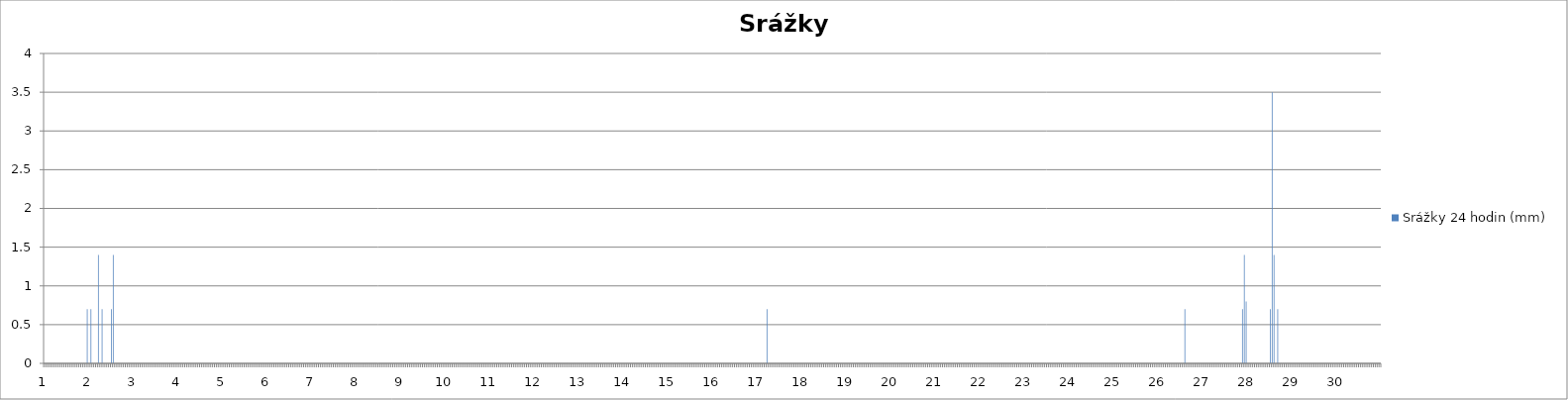
| Category | Srážky 24 hodin (mm) |
|---|---|
| 0 | 0 |
| 1 | 0 |
| 2 | 0 |
| 3 | 0 |
| 4 | 0 |
| 5 | 0 |
| 6 | 0 |
| 7 | 0 |
| 8 | 0 |
| 9 | 0 |
| 10 | 0 |
| 11 | 0 |
| 12 | 0 |
| 13 | 0 |
| 14 | 0 |
| 15 | 0 |
| 16 | 0 |
| 17 | 0 |
| 18 | 0 |
| 19 | 0 |
| 20 | 0 |
| 21 | 0 |
| 22 | 0 |
| 23 | 0.7 |
| 24 | 0 |
| 25 | 0.7 |
| 26 | 0 |
| 27 | 0 |
| 28 | 0 |
| 29 | 1.4 |
| 30 | 0 |
| 31 | 0.7 |
| 32 | 0 |
| 33 | 0 |
| 34 | 0 |
| 35 | 0 |
| 36 | 0.7 |
| 37 | 1.4 |
| 38 | 0 |
| 39 | 0 |
| 40 | 0 |
| 41 | 0 |
| 42 | 0 |
| 43 | 0 |
| 44 | 0 |
| 45 | 0 |
| 46 | 0 |
| 47 | 0 |
| 48 | 0 |
| 49 | 0 |
| 50 | 0 |
| 51 | 0 |
| 52 | 0 |
| 53 | 0 |
| 54 | 0 |
| 55 | 0 |
| 56 | 0 |
| 57 | 0 |
| 58 | 0 |
| 59 | 0 |
| 60 | 0 |
| 61 | 0 |
| 62 | 0 |
| 63 | 0 |
| 64 | 0 |
| 65 | 0 |
| 66 | 0 |
| 67 | 0 |
| 68 | 0 |
| 69 | 0 |
| 70 | 0 |
| 71 | 0 |
| 72 | 0 |
| 73 | 0 |
| 74 | 0 |
| 75 | 0 |
| 76 | 0 |
| 77 | 0 |
| 78 | 0 |
| 79 | 0 |
| 80 | 0 |
| 81 | 0 |
| 82 | 0 |
| 83 | 0 |
| 84 | 0 |
| 85 | 0 |
| 86 | 0 |
| 87 | 0 |
| 88 | 0 |
| 89 | 0 |
| 90 | 0 |
| 91 | 0 |
| 92 | 0 |
| 93 | 0 |
| 94 | 0 |
| 95 | 0 |
| 96 | 0 |
| 97 | 0 |
| 98 | 0 |
| 99 | 0 |
| 100 | 0 |
| 101 | 0 |
| 102 | 0 |
| 103 | 0 |
| 104 | 0 |
| 105 | 0 |
| 106 | 0 |
| 107 | 0 |
| 108 | 0 |
| 109 | 0 |
| 110 | 0 |
| 111 | 0 |
| 112 | 0 |
| 113 | 0 |
| 114 | 0 |
| 115 | 0 |
| 116 | 0 |
| 117 | 0 |
| 118 | 0 |
| 119 | 0 |
| 120 | 0 |
| 121 | 0 |
| 122 | 0 |
| 123 | 0 |
| 124 | 0 |
| 125 | 0 |
| 126 | 0 |
| 127 | 0 |
| 128 | 0 |
| 129 | 0 |
| 130 | 0 |
| 131 | 0 |
| 132 | 0 |
| 133 | 0 |
| 134 | 0 |
| 135 | 0 |
| 136 | 0 |
| 137 | 0 |
| 138 | 0 |
| 139 | 0 |
| 140 | 0 |
| 141 | 0 |
| 142 | 0 |
| 143 | 0 |
| 144 | 0 |
| 145 | 0 |
| 146 | 0 |
| 147 | 0 |
| 148 | 0 |
| 149 | 0 |
| 150 | 0 |
| 151 | 0 |
| 152 | 0 |
| 153 | 0 |
| 154 | 0 |
| 155 | 0 |
| 156 | 0 |
| 157 | 0 |
| 158 | 0 |
| 159 | 0 |
| 160 | 0 |
| 161 | 0 |
| 162 | 0 |
| 163 | 0 |
| 164 | 0 |
| 165 | 0 |
| 166 | 0 |
| 167 | 0 |
| 168 | 0 |
| 169 | 0 |
| 170 | 0 |
| 171 | 0 |
| 172 | 0 |
| 173 | 0 |
| 174 | 0 |
| 175 | 0 |
| 176 | 0 |
| 177 | 0 |
| 178 | 0 |
| 179 | 0 |
| 180 | 0 |
| 181 | 0 |
| 182 | 0 |
| 183 | 0 |
| 184 | 0 |
| 185 | 0 |
| 186 | 0 |
| 187 | 0 |
| 188 | 0 |
| 189 | 0 |
| 190 | 0 |
| 191 | 0 |
| 192 | 0 |
| 193 | 0 |
| 194 | 0 |
| 195 | 0 |
| 196 | 0 |
| 197 | 0 |
| 198 | 0 |
| 199 | 0 |
| 200 | 0 |
| 201 | 0 |
| 202 | 0 |
| 203 | 0 |
| 204 | 0 |
| 205 | 0 |
| 206 | 0 |
| 207 | 0 |
| 208 | 0 |
| 209 | 0 |
| 210 | 0 |
| 211 | 0 |
| 212 | 0 |
| 213 | 0 |
| 214 | 0 |
| 215 | 0 |
| 216 | 0 |
| 217 | 0 |
| 218 | 0 |
| 219 | 0 |
| 220 | 0 |
| 221 | 0 |
| 222 | 0 |
| 223 | 0 |
| 224 | 0 |
| 225 | 0 |
| 226 | 0 |
| 227 | 0 |
| 228 | 0 |
| 229 | 0 |
| 230 | 0 |
| 231 | 0 |
| 232 | 0 |
| 233 | 0 |
| 234 | 0 |
| 235 | 0 |
| 236 | 0 |
| 237 | 0 |
| 238 | 0 |
| 239 | 0 |
| 240 | 0 |
| 241 | 0 |
| 242 | 0 |
| 243 | 0 |
| 244 | 0 |
| 245 | 0 |
| 246 | 0 |
| 247 | 0 |
| 248 | 0 |
| 249 | 0 |
| 250 | 0 |
| 251 | 0 |
| 252 | 0 |
| 253 | 0 |
| 254 | 0 |
| 255 | 0 |
| 256 | 0 |
| 257 | 0 |
| 258 | 0 |
| 259 | 0 |
| 260 | 0 |
| 261 | 0 |
| 262 | 0 |
| 263 | 0 |
| 264 | 0 |
| 265 | 0 |
| 266 | 0 |
| 267 | 0 |
| 268 | 0 |
| 269 | 0 |
| 270 | 0 |
| 271 | 0 |
| 272 | 0 |
| 273 | 0 |
| 274 | 0 |
| 275 | 0 |
| 276 | 0 |
| 277 | 0 |
| 278 | 0 |
| 279 | 0 |
| 280 | 0 |
| 281 | 0 |
| 282 | 0 |
| 283 | 0 |
| 284 | 0 |
| 285 | 0 |
| 286 | 0 |
| 287 | 0 |
| 288 | 0 |
| 289 | 0 |
| 290 | 0 |
| 291 | 0 |
| 292 | 0 |
| 293 | 0 |
| 294 | 0 |
| 295 | 0 |
| 296 | 0 |
| 297 | 0 |
| 298 | 0 |
| 299 | 0 |
| 300 | 0 |
| 301 | 0 |
| 302 | 0 |
| 303 | 0 |
| 304 | 0 |
| 305 | 0 |
| 306 | 0 |
| 307 | 0 |
| 308 | 0 |
| 309 | 0 |
| 310 | 0 |
| 311 | 0 |
| 312 | 0 |
| 313 | 0 |
| 314 | 0 |
| 315 | 0 |
| 316 | 0 |
| 317 | 0 |
| 318 | 0 |
| 319 | 0 |
| 320 | 0 |
| 321 | 0 |
| 322 | 0 |
| 323 | 0 |
| 324 | 0 |
| 325 | 0 |
| 326 | 0 |
| 327 | 0 |
| 328 | 0 |
| 329 | 0 |
| 330 | 0 |
| 331 | 0 |
| 332 | 0 |
| 333 | 0 |
| 334 | 0 |
| 335 | 0 |
| 336 | 0 |
| 337 | 0 |
| 338 | 0 |
| 339 | 0 |
| 340 | 0 |
| 341 | 0 |
| 342 | 0 |
| 343 | 0 |
| 344 | 0 |
| 345 | 0 |
| 346 | 0 |
| 347 | 0 |
| 348 | 0 |
| 349 | 0 |
| 350 | 0 |
| 351 | 0 |
| 352 | 0 |
| 353 | 0 |
| 354 | 0 |
| 355 | 0 |
| 356 | 0 |
| 357 | 0 |
| 358 | 0 |
| 359 | 0 |
| 360 | 0 |
| 361 | 0 |
| 362 | 0 |
| 363 | 0 |
| 364 | 0 |
| 365 | 0 |
| 366 | 0 |
| 367 | 0 |
| 368 | 0 |
| 369 | 0 |
| 370 | 0 |
| 371 | 0 |
| 372 | 0 |
| 373 | 0 |
| 374 | 0 |
| 375 | 0 |
| 376 | 0 |
| 377 | 0 |
| 378 | 0 |
| 379 | 0 |
| 380 | 0 |
| 381 | 0 |
| 382 | 0 |
| 383 | 0 |
| 384 | 0 |
| 385 | 0 |
| 386 | 0 |
| 387 | 0 |
| 388 | 0 |
| 389 | 0.7 |
| 390 | 0 |
| 391 | 0 |
| 392 | 0 |
| 393 | 0 |
| 394 | 0 |
| 395 | 0 |
| 396 | 0 |
| 397 | 0 |
| 398 | 0 |
| 399 | 0 |
| 400 | 0 |
| 401 | 0 |
| 402 | 0 |
| 403 | 0 |
| 404 | 0 |
| 405 | 0 |
| 406 | 0 |
| 407 | 0 |
| 408 | 0 |
| 409 | 0 |
| 410 | 0 |
| 411 | 0 |
| 412 | 0 |
| 413 | 0 |
| 414 | 0 |
| 415 | 0 |
| 416 | 0 |
| 417 | 0 |
| 418 | 0 |
| 419 | 0 |
| 420 | 0 |
| 421 | 0 |
| 422 | 0 |
| 423 | 0 |
| 424 | 0 |
| 425 | 0 |
| 426 | 0 |
| 427 | 0 |
| 428 | 0 |
| 429 | 0 |
| 430 | 0 |
| 431 | 0 |
| 432 | 0 |
| 433 | 0 |
| 434 | 0 |
| 435 | 0 |
| 436 | 0 |
| 437 | 0 |
| 438 | 0 |
| 439 | 0 |
| 440 | 0 |
| 441 | 0 |
| 442 | 0 |
| 443 | 0 |
| 444 | 0 |
| 445 | 0 |
| 446 | 0 |
| 447 | 0 |
| 448 | 0 |
| 449 | 0 |
| 450 | 0 |
| 451 | 0 |
| 452 | 0 |
| 453 | 0 |
| 454 | 0 |
| 455 | 0 |
| 456 | 0 |
| 457 | 0 |
| 458 | 0 |
| 459 | 0 |
| 460 | 0 |
| 461 | 0 |
| 462 | 0 |
| 463 | 0 |
| 464 | 0 |
| 465 | 0 |
| 466 | 0 |
| 467 | 0 |
| 468 | 0 |
| 469 | 0 |
| 470 | 0 |
| 471 | 0 |
| 472 | 0 |
| 473 | 0 |
| 474 | 0 |
| 475 | 0 |
| 476 | 0 |
| 477 | 0 |
| 478 | 0 |
| 479 | 0 |
| 480 | 0 |
| 481 | 0 |
| 482 | 0 |
| 483 | 0 |
| 484 | 0 |
| 485 | 0 |
| 486 | 0 |
| 487 | 0 |
| 488 | 0 |
| 489 | 0 |
| 490 | 0 |
| 491 | 0 |
| 492 | 0 |
| 493 | 0 |
| 494 | 0 |
| 495 | 0 |
| 496 | 0 |
| 497 | 0 |
| 498 | 0 |
| 499 | 0 |
| 500 | 0 |
| 501 | 0 |
| 502 | 0 |
| 503 | 0 |
| 504 | 0 |
| 505 | 0 |
| 506 | 0 |
| 507 | 0 |
| 508 | 0 |
| 509 | 0 |
| 510 | 0 |
| 511 | 0 |
| 512 | 0 |
| 513 | 0 |
| 514 | 0 |
| 515 | 0 |
| 516 | 0 |
| 517 | 0 |
| 518 | 0 |
| 519 | 0 |
| 520 | 0 |
| 521 | 0 |
| 522 | 0 |
| 523 | 0 |
| 524 | 0 |
| 525 | 0 |
| 526 | 0 |
| 527 | 0 |
| 528 | 0 |
| 529 | 0 |
| 530 | 0 |
| 531 | 0 |
| 532 | 0 |
| 533 | 0 |
| 534 | 0 |
| 535 | 0 |
| 536 | 0 |
| 537 | 0 |
| 538 | 0 |
| 539 | 0 |
| 540 | 0 |
| 541 | 0 |
| 542 | 0 |
| 543 | 0 |
| 544 | 0 |
| 545 | 0 |
| 546 | 0 |
| 547 | 0 |
| 548 | 0 |
| 549 | 0 |
| 550 | 0 |
| 551 | 0 |
| 552 | 0 |
| 553 | 0 |
| 554 | 0 |
| 555 | 0 |
| 556 | 0 |
| 557 | 0 |
| 558 | 0 |
| 559 | 0 |
| 560 | 0 |
| 561 | 0 |
| 562 | 0 |
| 563 | 0 |
| 564 | 0 |
| 565 | 0 |
| 566 | 0 |
| 567 | 0 |
| 568 | 0 |
| 569 | 0 |
| 570 | 0 |
| 571 | 0 |
| 572 | 0 |
| 573 | 0 |
| 574 | 0 |
| 575 | 0 |
| 576 | 0 |
| 577 | 0 |
| 578 | 0 |
| 579 | 0 |
| 580 | 0 |
| 581 | 0 |
| 582 | 0 |
| 583 | 0 |
| 584 | 0 |
| 585 | 0 |
| 586 | 0 |
| 587 | 0 |
| 588 | 0 |
| 589 | 0 |
| 590 | 0 |
| 591 | 0 |
| 592 | 0 |
| 593 | 0 |
| 594 | 0 |
| 595 | 0 |
| 596 | 0 |
| 597 | 0 |
| 598 | 0 |
| 599 | 0 |
| 600 | 0 |
| 601 | 0 |
| 602 | 0 |
| 603 | 0 |
| 604 | 0 |
| 605 | 0 |
| 606 | 0 |
| 607 | 0 |
| 608 | 0 |
| 609 | 0 |
| 610 | 0 |
| 611 | 0 |
| 612 | 0 |
| 613 | 0 |
| 614 | 0.7 |
| 615 | 0 |
| 616 | 0 |
| 617 | 0 |
| 618 | 0 |
| 619 | 0 |
| 620 | 0 |
| 621 | 0 |
| 622 | 0 |
| 623 | 0 |
| 624 | 0 |
| 625 | 0 |
| 626 | 0 |
| 627 | 0 |
| 628 | 0 |
| 629 | 0 |
| 630 | 0 |
| 631 | 0 |
| 632 | 0 |
| 633 | 0 |
| 634 | 0 |
| 635 | 0 |
| 636 | 0 |
| 637 | 0 |
| 638 | 0 |
| 639 | 0 |
| 640 | 0 |
| 641 | 0 |
| 642 | 0 |
| 643 | 0 |
| 644 | 0 |
| 645 | 0.7 |
| 646 | 1.4 |
| 647 | 0.8 |
| 648 | 0 |
| 649 | 0 |
| 650 | 0 |
| 651 | 0 |
| 652 | 0 |
| 653 | 0 |
| 654 | 0 |
| 655 | 0 |
| 656 | 0 |
| 657 | 0 |
| 658 | 0 |
| 659 | 0 |
| 660 | 0.7 |
| 661 | 3.5 |
| 662 | 1.4 |
| 663 | 0 |
| 664 | 0.7 |
| 665 | 0 |
| 666 | 0 |
| 667 | 0 |
| 668 | 0 |
| 669 | 0 |
| 670 | 0 |
| 671 | 0 |
| 672 | 0 |
| 673 | 0 |
| 674 | 0 |
| 675 | 0 |
| 676 | 0 |
| 677 | 0 |
| 678 | 0 |
| 679 | 0 |
| 680 | 0 |
| 681 | 0 |
| 682 | 0 |
| 683 | 0 |
| 684 | 0 |
| 685 | 0 |
| 686 | 0 |
| 687 | 0 |
| 688 | 0 |
| 689 | 0 |
| 690 | 0 |
| 691 | 0 |
| 692 | 0 |
| 693 | 0 |
| 694 | 0 |
| 695 | 0 |
| 696 | 0 |
| 697 | 0 |
| 698 | 0 |
| 699 | 0 |
| 700 | 0 |
| 701 | 0 |
| 702 | 0 |
| 703 | 0 |
| 704 | 0 |
| 705 | 0 |
| 706 | 0 |
| 707 | 0 |
| 708 | 0 |
| 709 | 0 |
| 710 | 0 |
| 711 | 0 |
| 712 | 0 |
| 713 | 0 |
| 714 | 0 |
| 715 | 0 |
| 716 | 0 |
| 717 | 0 |
| 718 | 0 |
| 719 | 0 |